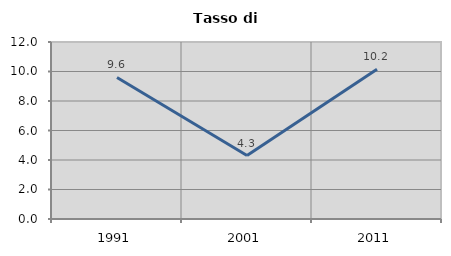
| Category | Tasso di disoccupazione   |
|---|---|
| 1991.0 | 9.599 |
| 2001.0 | 4.302 |
| 2011.0 | 10.156 |